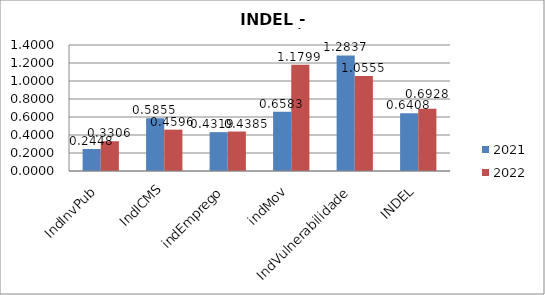
| Category | 2021 | 2022 |
|---|---|---|
| IndInvPub | 0.245 | 0.331 |
| IndICMS | 0.586 | 0.46 |
| indEmprego | 0.432 | 0.439 |
| indMov | 0.658 | 1.18 |
| IndVulnerabilidade | 1.284 | 1.055 |
| INDEL | 0.641 | 0.693 |